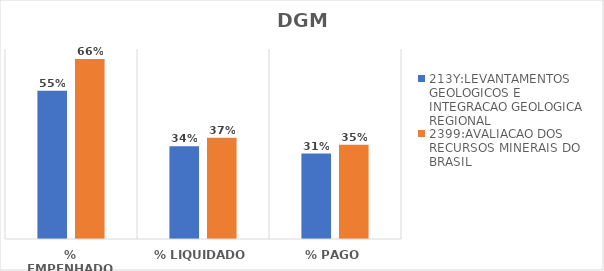
| Category | 213Y:LEVANTAMENTOS GEOLOGICOS E INTEGRACAO GEOLOGICA REGIONAL | 2399:AVALIACAO DOS RECURSOS MINERAIS DO BRASIL |
|---|---|---|
| % EMPENHADO | 0.546 | 0.663 |
| % LIQUIDADO | 0.342 | 0.373 |
| % PAGO | 0.315 | 0.347 |